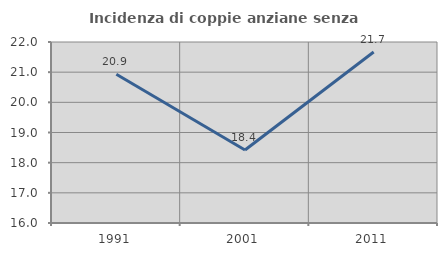
| Category | Incidenza di coppie anziane senza figli  |
|---|---|
| 1991.0 | 20.93 |
| 2001.0 | 18.421 |
| 2011.0 | 21.667 |